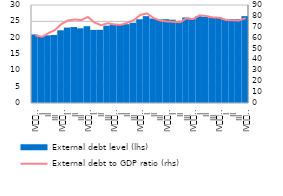
| Category | External debt level (lhs) |
|---|---|
| IV
2008 | 20.982 |
| I | 20.211 |
| II | 20.713 |
| III | 20.839 |
| IV
2009 | 22.272 |
| I | 23.09 |
| II | 23.254 |
| III | 22.861 |
| IV
2010 | 23.509 |
| I | 22.384 |
| II | 22.4 |
| III | 23.676 |
| IV
2011 | 24.123 |
| I | 23.947 |
| II | 24.124 |
| III | 24.565 |
| IV
2012 | 25.645 |
| I | 26.582 |
| II | 25.858 |
| III | 25.582 |
| IV
2013 | 25.644 |
| I | 25.497 |
| II | 25.144 |
| III | 26.171 |
| IV
2014 | 25.679 |
| I | 26.552 |
| II | 26.348 |
| III | 26.111 |
| IV
2015 | 26.234 |
| I | 25.731 |
| II | 25.695 |
| III | 25.674 |
| IV
2016 | 26.592 |